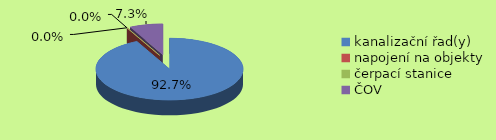
| Category | Series 0 | Series 1 |
|---|---|---|
| kanalizační řad(y) | 4474903.317 |  |
| napojení na objekty | 0 |  |
| čerpací stanice | 0 |  |
| ČOV | 353750 |  |